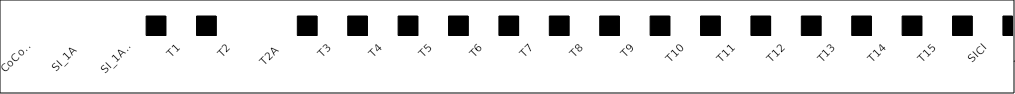
| Category | Series 0 |
|---|---|
| CoCoCo | 0 |
| SI_1A | 0 |
| SI_1A_CONV | 0 |
| T1 | 1 |
| T2 | 1 |
| T2A | 0 |
| T3 | 1 |
| T4 | 1 |
| T5 | 1 |
| T6 | 1 |
| T7 | 1 |
| T8 | 1 |
| T9 | 1 |
| T10 | 1 |
| T11 | 1 |
| T12 | 1 |
| T13 | 1 |
| T14 | 1 |
| T15 | 1 |
| SICI | 1 |
| TRC | 1 |